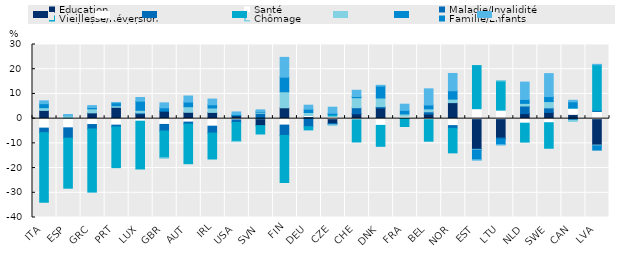
| Category | Éducation | Santé | Maladie/Invalidité | Vieillesse/Réversion | Chômage | Famille/Enfants | Exclusion sociale/Logement |
|---|---|---|---|---|---|---|---|
| ITA | 3.334 | -3.833 | -1.859 | -28.135 | 1.11 | 1.6 | 1.147 |
| ESP | 0.105 | -3.721 | -4.17 | -20.249 | 1.088 | 0.087 | 0.385 |
| GRC | 2.338 | -2.385 | -1.799 | -25.541 | 1.636 | 0.499 | 0.799 |
| PRT | 4.592 | -2.629 | -0.746 | -16.451 | 0.624 | 1.216 | 0.123 |
| LUX | 1.977 | -1.023 | 0.355 | -19.343 | 1.037 | 3.7 | 1.481 |
| GBR | 3.029 | -2.345 | -2.642 | -10.871 | -0.008 | 1.363 | 1.997 |
| AUT | 2.575 | -1.398 | -0.834 | -16.002 | 2.26 | 1.87 | 2.446 |
| IRL | 2.526 | -3.049 | -2.783 | -10.498 | 1.782 | 1.318 | 2.295 |
| USA | 1.167 | -0.482 | -1.057 | -7.67 | -0.095 | 0.522 | 1.019 |
| SVN | -2.832 | 0.008 | 2.148 | -3.378 | 0.434 | 0.236 | 0.726 |
| FIN | 4.396 | -2.606 | -4.187 | -19.052 | 6.482 | 5.908 | 8 |
| DEU | 0.799 | 0.465 | -3.257 | -1.301 | 1.209 | 1.356 | 1.611 |
| CZE | -1.95 | 1.012 | -0.512 | 0.64 | -0.199 | 0.534 | 2.432 |
| CHE | 1.959 | -0.469 | 2.465 | -8.973 | 4.057 | 0.449 | 2.55 |
| DNK | 4.281 | -2.727 | 0.583 | -8.466 | 3.487 | 4.846 | 0.286 |
| FRA | -0.005 | 0.964 | -0.02 | -3.16 | 0.934 | 1.456 | 2.492 |
| BEL | 1.826 | -0.42 | 0.953 | -8.713 | 1.19 | 1.567 | 6.524 |
| NOR | 6.479 | -2.828 | -1.077 | -9.937 | 1.411 | 3.408 | 6.985 |
| EST | -12.292 | 4.026 | -0.332 | 17.436 | -0.222 | -3.737 | -0.183 |
| LTU | -7.813 | 3.444 | -0.522 | 11.821 | 0.105 | -2.147 | -0.156 |
| NLD | 2.052 | -1.845 | 3.058 | -7.639 | 1.074 | 1.59 | 7.012 |
| SWE | 2.514 | -1.646 | 1.841 | -10.332 | 2.547 | 2.035 | 9.273 |
| CAN | 1.709 | 2.492 | -0.632 | 0.229 | -0.509 | 2.374 | 0.627 |
| LVA | -10.702 | 2.914 | 0.421 | 18.458 | -0.299 | -1.728 | 0.176 |